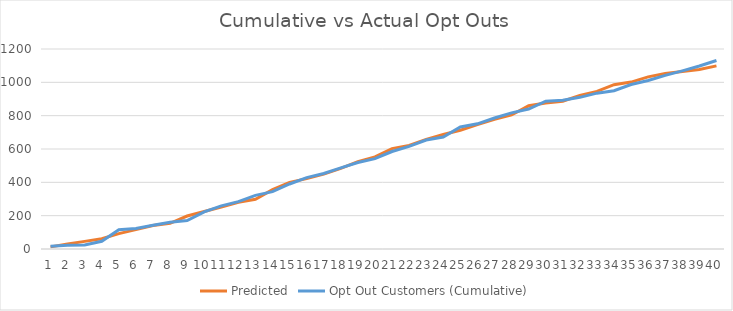
| Category | Predicted | Opt Out Customers (Cumulative) |
|---|---|---|
| 0 | 12.856 | 17 |
| 1 | 29.492 | 22 |
| 2 | 45.69 | 24 |
| 3 | 61.331 | 46 |
| 4 | 92.326 | 115 |
| 5 | 116.095 | 123 |
| 6 | 140.423 | 143 |
| 7 | 154.441 | 161 |
| 8 | 197.998 | 171 |
| 9 | 225.43 | 223 |
| 10 | 251.545 | 259 |
| 11 | 280.701 | 284 |
| 12 | 298.281 | 322 |
| 13 | 355.951 | 344 |
| 14 | 399.585 | 390 |
| 15 | 422.333 | 428 |
| 16 | 449.172 | 453 |
| 17 | 483.934 | 487 |
| 18 | 523.734 | 519 |
| 19 | 552.594 | 542 |
| 20 | 602.24 | 585 |
| 21 | 621.285 | 616 |
| 22 | 657.367 | 654 |
| 23 | 687.046 | 672 |
| 24 | 712.728 | 732 |
| 25 | 746.242 | 751 |
| 26 | 778.621 | 786 |
| 27 | 804.243 | 817 |
| 28 | 859.164 | 840 |
| 29 | 876.602 | 887 |
| 30 | 886.698 | 893 |
| 31 | 921.701 | 910 |
| 32 | 945.96 | 935 |
| 33 | 985.944 | 950 |
| 34 | 1001.586 | 987 |
| 35 | 1032.587 | 1011 |
| 36 | 1052.706 | 1042 |
| 37 | 1065.208 | 1069 |
| 38 | 1076.967 | 1098 |
| 39 | 1098.64 | 1131 |